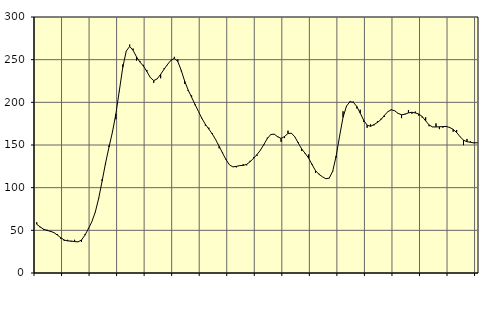
| Category | Piggar | Series 1 |
|---|---|---|
| nan | 59.4 | 57.1 |
| 87.0 | 53.4 | 54 |
| 87.0 | 50.4 | 51.34 |
| 87.0 | 50.7 | 49.83 |
| nan | 48 | 48.89 |
| 88.0 | 47 | 47.31 |
| 88.0 | 45.7 | 44.5 |
| 88.0 | 40 | 41.32 |
| nan | 37.5 | 38.69 |
| 89.0 | 38.9 | 37.6 |
| 89.0 | 36.7 | 37.46 |
| 89.0 | 38.9 | 36.82 |
| nan | 36.8 | 36.45 |
| 90.0 | 36.3 | 38.65 |
| 90.0 | 45.2 | 44.31 |
| 90.0 | 52.5 | 51.79 |
| nan | 60.1 | 59.98 |
| 91.0 | 70.8 | 71.1 |
| 91.0 | 86.9 | 87.43 |
| 91.0 | 109.9 | 107.69 |
| nan | 127.3 | 128.75 |
| 92.0 | 149.5 | 147.6 |
| 92.0 | 166.2 | 165.13 |
| 92.0 | 180.2 | 186.42 |
| nan | 212.9 | 213.53 |
| 93.0 | 244.3 | 241 |
| 93.0 | 259.8 | 259.98 |
| 93.0 | 267.7 | 265.51 |
| nan | 263 | 260.98 |
| 94.0 | 248.9 | 253.2 |
| 94.0 | 248.2 | 247.12 |
| 94.0 | 243.9 | 242.51 |
| nan | 238 | 236.09 |
| 95.0 | 229.3 | 229.07 |
| 95.0 | 222.9 | 225.51 |
| 95.0 | 227.8 | 227.44 |
| nan | 228.2 | 232.83 |
| 96.0 | 239.9 | 238.79 |
| 96.0 | 243.6 | 244.38 |
| 96.0 | 248.9 | 249.34 |
| nan | 253.3 | 251.56 |
| 97.0 | 250.3 | 247.75 |
| 97.0 | 236.4 | 237.29 |
| 97.0 | 221.7 | 224.7 |
| nan | 213.2 | 214.38 |
| 98.0 | 208.1 | 205.99 |
| 98.0 | 196.6 | 197.57 |
| 98.0 | 189.1 | 189.17 |
| nan | 180.6 | 181.09 |
| 99.0 | 172.7 | 174.29 |
| 99.0 | 170.3 | 168.63 |
| 99.0 | 164 | 162.97 |
| nan | 156.5 | 156.24 |
| 0.0 | 146.1 | 148.51 |
| 0.0 | 141.2 | 140.48 |
| 0.0 | 133.4 | 132.79 |
| nan | 126.8 | 126.73 |
| 1.0 | 124.3 | 124.33 |
| 1.0 | 123.8 | 124.94 |
| 1.0 | 126.1 | 125.85 |
| nan | 127.5 | 126.11 |
| 2.0 | 126.2 | 127.32 |
| 2.0 | 131.5 | 130.41 |
| 2.0 | 135.6 | 134.45 |
| nan | 137.2 | 138.81 |
| 3.0 | 144.3 | 144 |
| 3.0 | 149.9 | 150.64 |
| 3.0 | 158.6 | 157.56 |
| nan | 162.6 | 162.3 |
| 4.0 | 162.4 | 162.73 |
| 4.0 | 160.4 | 159.62 |
| 4.0 | 153.7 | 157.74 |
| nan | 158.1 | 159.94 |
| 5.0 | 166.8 | 163.44 |
| 5.0 | 163.3 | 163.79 |
| 5.0 | 159.3 | 159.52 |
| nan | 153.2 | 152.23 |
| 6.0 | 142.9 | 145.25 |
| 6.0 | 139.6 | 140.18 |
| 6.0 | 138.9 | 134.62 |
| nan | 127.8 | 127 |
| 7.0 | 117.3 | 119.97 |
| 7.0 | 116.3 | 115.65 |
| 7.0 | 112.8 | 112.78 |
| nan | 110.2 | 110.45 |
| 8.0 | 111 | 111.22 |
| 8.0 | 118.7 | 119.33 |
| 8.0 | 135.2 | 137.14 |
| nan | 160.5 | 160.45 |
| 9.0 | 189.5 | 182.44 |
| 9.0 | 194.7 | 195.59 |
| 9.0 | 201.4 | 200.7 |
| nan | 200.8 | 200.02 |
| 10.0 | 192.9 | 195.12 |
| 10.0 | 191.3 | 187.27 |
| 10.0 | 177 | 178.97 |
| nan | 170.2 | 173.21 |
| 11.0 | 174.2 | 171.9 |
| 11.0 | 173 | 173.95 |
| 11.0 | 177.8 | 176.44 |
| nan | 180.8 | 179.76 |
| 12.0 | 182.8 | 184.59 |
| 12.0 | 189.3 | 189.02 |
| 12.0 | 191.8 | 191.27 |
| nan | 189.8 | 190.14 |
| 13.0 | 187.5 | 187.06 |
| 13.0 | 181.5 | 185.4 |
| 13.0 | 186.6 | 186.05 |
| nan | 191 | 187.68 |
| 14.0 | 186.6 | 188.34 |
| 14.0 | 189.2 | 187.52 |
| 14.0 | 184.4 | 186.32 |
| nan | 182.2 | 183.33 |
| 15.0 | 182.5 | 178.28 |
| 15.0 | 172 | 173.5 |
| 15.0 | 171 | 171.18 |
| nan | 175.3 | 171.14 |
| 16.0 | 168.6 | 171.32 |
| 16.0 | 170.3 | 171.64 |
| 16.0 | 172.3 | 171.68 |
| nan | 170.1 | 170.51 |
| 17.0 | 165.6 | 168.3 |
| 17.0 | 167.6 | 164.66 |
| 17.0 | 159.5 | 159.77 |
| nan | 149.8 | 155.6 |
| 18.0 | 157.1 | 153.85 |
| 18.0 | 154.4 | 153.24 |
| 18.0 | 153 | 152.41 |
| nan | 153 | 152.66 |